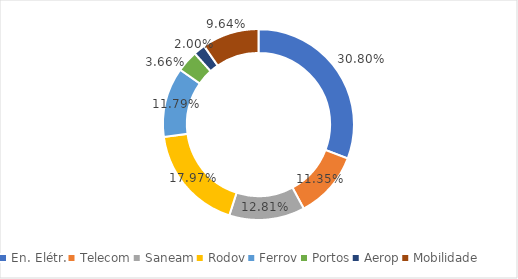
| Category | Series 0 |
|---|---|
| En. Elétr. | 0.308 |
| Telecom | 0.113 |
| Saneam | 0.128 |
| Rodov | 0.18 |
| Ferrov | 0.118 |
| Portos | 0.037 |
| Aerop | 0.02 |
| Mobilidade | 0.096 |